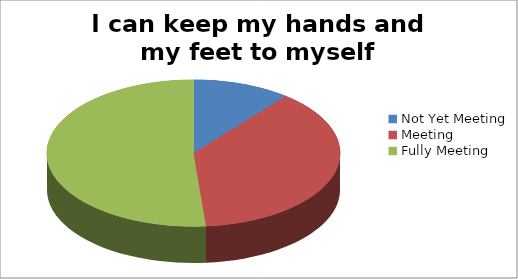
| Category | I can keep my hands and my feet to myself |
|---|---|
| Not Yet Meeting | 4 |
| Meeting | 14 |
| Fully Meeting | 19 |